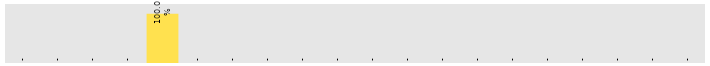
| Category | Sunday |
|---|---|
| Accounts | 0 |
| HR | 0 |
| Lobby/Reception | 0 |
| Administration | 0 |
| Customer Support | 1 |
| Finance | 0 |
| Human Resources | 0 |
| IT | 0 |
| Marketing | 0 |
| R&D | 0 |
| Sales | 0 |